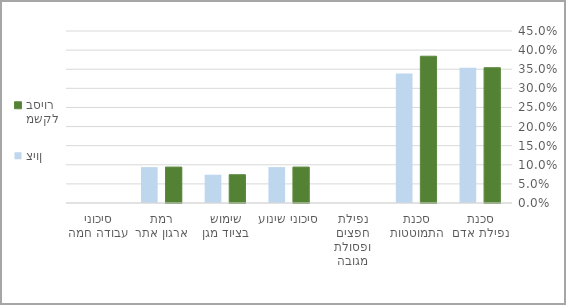
| Category | משקל בסיור | ציון |
|---|---|---|
| סכנת נפילת אדם | 0.354 | 0.354 |
| סכנת התמוטטות | 0.384 | 0.339 |
| נפילת חפצים ופסולת מגובה | 0 | 0 |
| סיכוני שינוע | 0.094 | 0.094 |
| שימוש בציוד מגן | 0.074 | 0.074 |
| רמת ארגון אתר | 0.094 | 0.094 |
| סיכוני עבודה חמה | 0 | 0 |